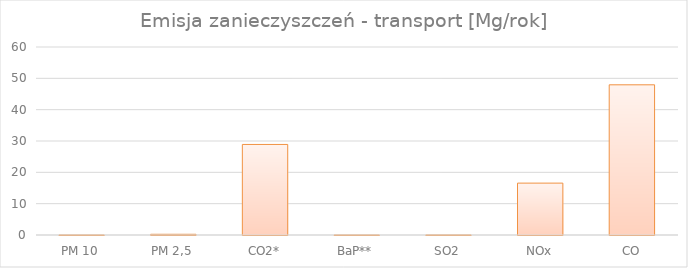
| Category | PM 10 |
|---|---|
| PM 10 | 0.002 |
| PM 2,5 | 0.226 |
| CO2* | 28.895 |
| BaP** | 0 |
| SO2 | 0.017 |
| NOx | 16.557 |
| CO | 47.93 |